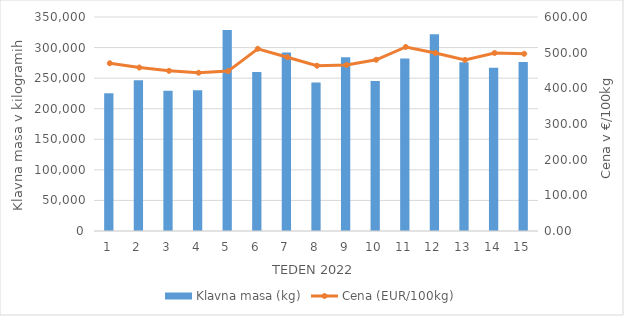
| Category | Klavna masa (kg) |
|---|---|
| 1.0 | 225300 |
| 2.0 | 246712 |
| 3.0 | 229541 |
| 4.0 | 230074 |
| 5.0 | 328640 |
| 6.0 | 260108 |
| 7.0 | 291887 |
| 8.0 | 242732 |
| 9.0 | 283987 |
| 10.0 | 245414 |
| 11.0 | 282092 |
| 12.0 | 321936 |
| 13.0 | 275950 |
| 14.0 | 267148 |
| 15.0 | 276417 |